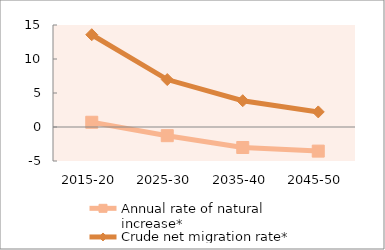
| Category | Annual rate of natural increase* | Crude net migration rate* |
|---|---|---|
| 2015-20 | 0.697 | 13.569 |
| 2025-30 | -1.276 | 6.978 |
| 2035-40 | -3.013 | 3.867 |
| 2045-50 | -3.547 | 2.219 |